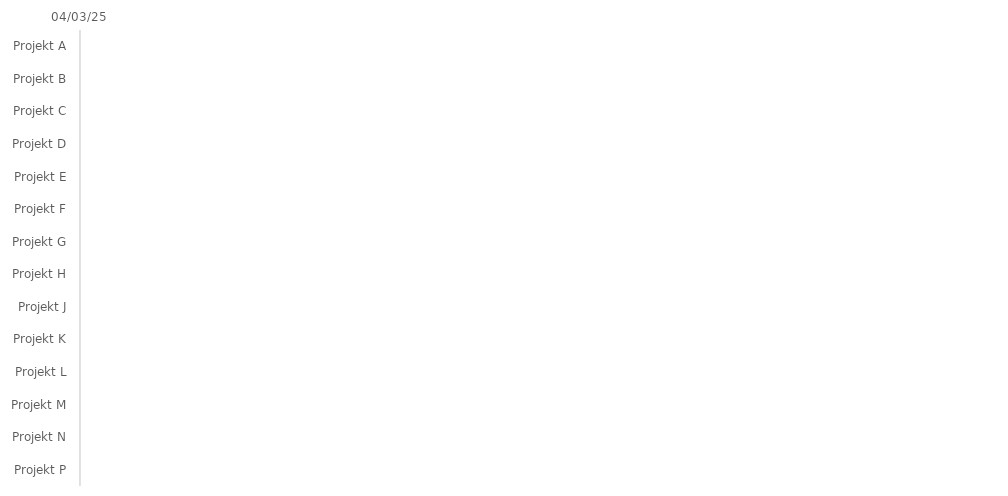
| Category | BEGINNEN | Dauer |
|---|---|---|
| Projekt A |  | 0 |
| Projekt B |  | 0 |
| Projekt C |  | 0 |
| Projekt D |  | 0 |
| Projekt E |  | 0 |
| Projekt F |  | 0 |
| Projekt G |  | 0 |
| Projekt H |  | 0 |
| Projekt J |  | 0 |
| Projekt K |  | 0 |
| Projekt L |  | 0 |
| Projekt M |  | 0 |
| Projekt N |  | 0 |
| Projekt P |  | 0 |